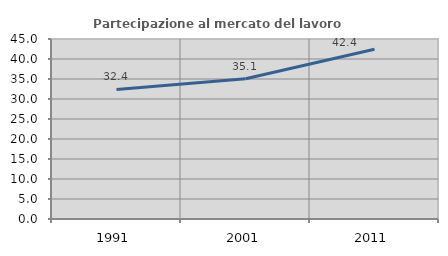
| Category | Partecipazione al mercato del lavoro  femminile |
|---|---|
| 1991.0 | 32.381 |
| 2001.0 | 35.052 |
| 2011.0 | 42.424 |